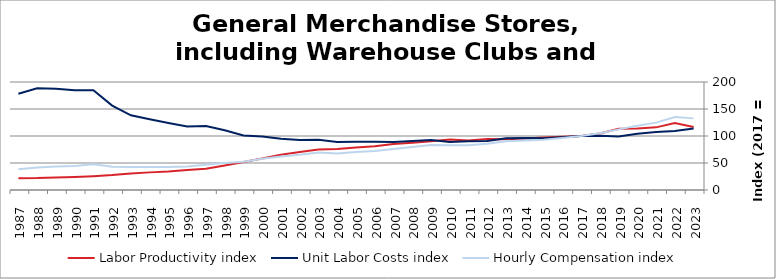
| Category | Labor Productivity index | Unit Labor Costs index | Hourly Compensation index |
|---|---|---|---|
| 2023.0 | 116.679 | 113.678 | 132.639 |
| 2022.0 | 124.085 | 109.052 | 135.317 |
| 2021.0 | 115.982 | 107.549 | 124.738 |
| 2020.0 | 114.013 | 104.21 | 118.813 |
| 2019.0 | 113.476 | 98.956 | 112.291 |
| 2018.0 | 104.798 | 100.306 | 105.119 |
| 2017.0 | 100 | 100 | 100 |
| 2016.0 | 98.546 | 97.829 | 96.407 |
| 2015.0 | 97.243 | 95.737 | 93.097 |
| 2014.0 | 95.39 | 96.333 | 91.892 |
| 2013.0 | 94.027 | 95.898 | 90.17 |
| 2012.0 | 94.346 | 90.57 | 85.449 |
| 2011.0 | 91.823 | 90.07 | 82.705 |
| 2010.0 | 93.368 | 88.929 | 83.032 |
| 2009.0 | 90.416 | 92.389 | 83.534 |
| 2008.0 | 87.456 | 90.915 | 79.51 |
| 2007.0 | 85.393 | 88.973 | 75.976 |
| 2006.0 | 81.021 | 89.148 | 72.229 |
| 2005.0 | 78.921 | 89.438 | 70.585 |
| 2004.0 | 75.952 | 88.979 | 67.581 |
| 2003.0 | 74.904 | 92.959 | 69.63 |
| 2002.0 | 70.506 | 92.419 | 65.161 |
| 2001.0 | 65.415 | 95.034 | 62.166 |
| 2000.0 | 58.299 | 99.034 | 57.735 |
| 1999.0 | 51.74 | 100.828 | 52.168 |
| 1998.0 | 45.222 | 110.578 | 50.006 |
| 1997.0 | 39.431 | 118.554 | 46.748 |
| 1996.0 | 36.95 | 117.696 | 43.489 |
| 1995.0 | 34.31 | 123.983 | 42.539 |
| 1994.0 | 32.639 | 130.937 | 42.736 |
| 1993.0 | 30.698 | 138.388 | 42.483 |
| 1992.0 | 27.614 | 156.353 | 43.176 |
| 1991.0 | 25.689 | 184.927 | 47.506 |
| 1990.0 | 24.168 | 184.525 | 44.596 |
| 1989.0 | 23.296 | 187.352 | 43.645 |
| 1988.0 | 22.046 | 188.311 | 41.514 |
| 1987.0 | 21.636 | 178.109 | 38.535 |